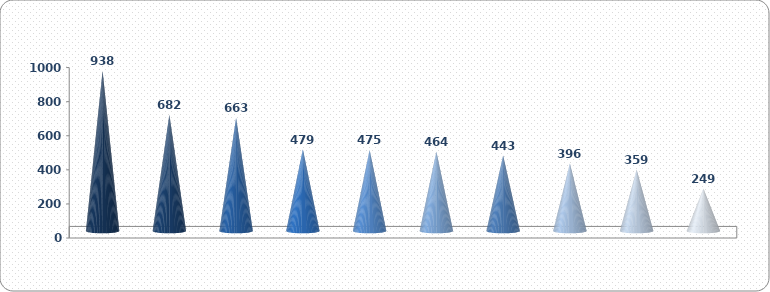
| Category | Series 0 |
|---|---|
| Kastav | 938.301 |
| Opatija | 682.055 |
| Rijeka | 662.987 |
| Viškovo | 479.357 |
| Klana | 475.46 |
| Čavle | 464.416 |
| Kosrena | 442.849 |
| Kraljevica | 395.951 |
| Lovran | 358.714 |
| Mošć. Draga | 248.515 |